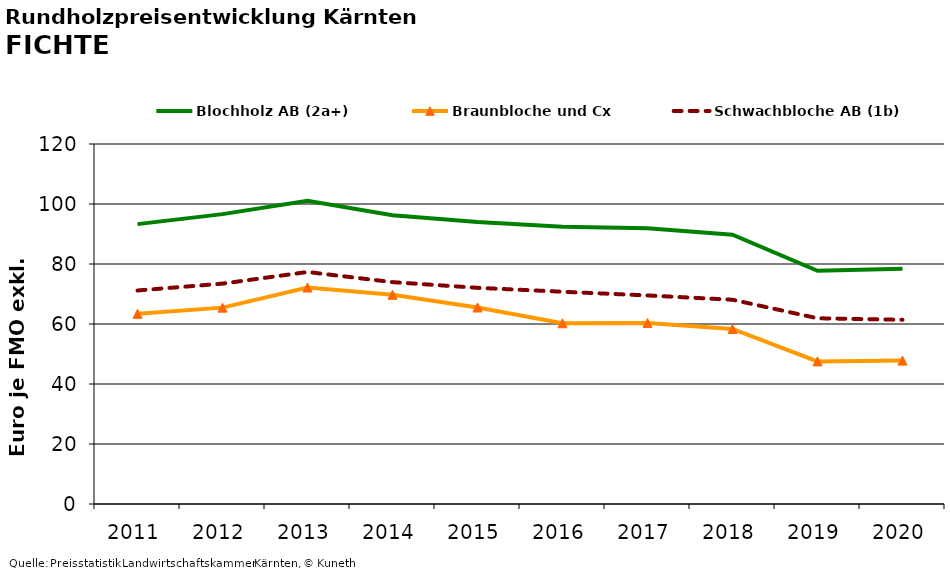
| Category | Blochholz AB (2a+) | Braunbloche und Cx | Schwachbloche AB (1b) |
|---|---|---|---|
| 2011.0 | 93.292 | 63.396 | 71.167 |
| 2012.0 | 96.626 | 65.458 | 73.458 |
| 2013.0 | 101.086 | 72.167 | 77.333 |
| 2014.0 | 96.258 | 69.75 | 73.958 |
| 2015.0 | 94.029 | 65.5 | 72.062 |
| 2016.0 | 92.433 | 60.25 | 70.75 |
| 2017.0 | 91.951 | 60.354 | 69.521 |
| 2018.0 | 89.753 | 58.333 | 68.083 |
| 2019.0 | 77.726 | 47.542 | 61.917 |
| 2020.0 | 78.4 | 47.8 | 61.4 |